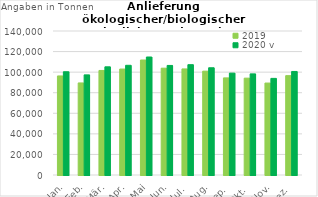
| Category | 2019 | 2020 v |
|---|---|---|
| Jan. | 96300.384 | 100386.304 |
| Feb. | 89503.84 | 97336.193 |
| Mär. | 101631.768 | 105169.957 |
| Apr. | 103000.389 | 106654.42 |
| Mai | 111805.508 | 114708.222 |
| Jun. | 103856.721 | 106515.106 |
| Jul. | 103120.1 | 107250.237 |
| Aug. | 100970.96 | 104258.551 |
| Sep. | 94405.782 | 99053.88 |
| Okt. | 94157.376 | 98313.065 |
| Nov. | 89394.199 | 93931.557 |
| Dez. | 96594.992 | 100660.199 |